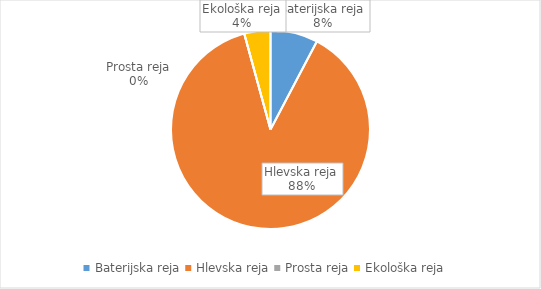
| Category | Količina kosov jajc |
|---|---|
| Baterijska reja | 264135 |
| Hlevska reja | 3013818 |
| Prosta reja | 298.52 |
| Ekološka reja | 145744 |